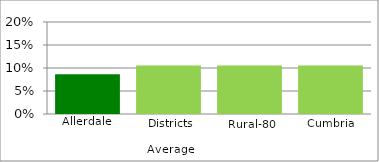
| Category | Series 1 |
|---|---|
| Allerdale | 0.087 |
| Districts Average | 0.105 |
| Rural-80 | 0.105 |
| Cumbria | 0.105 |